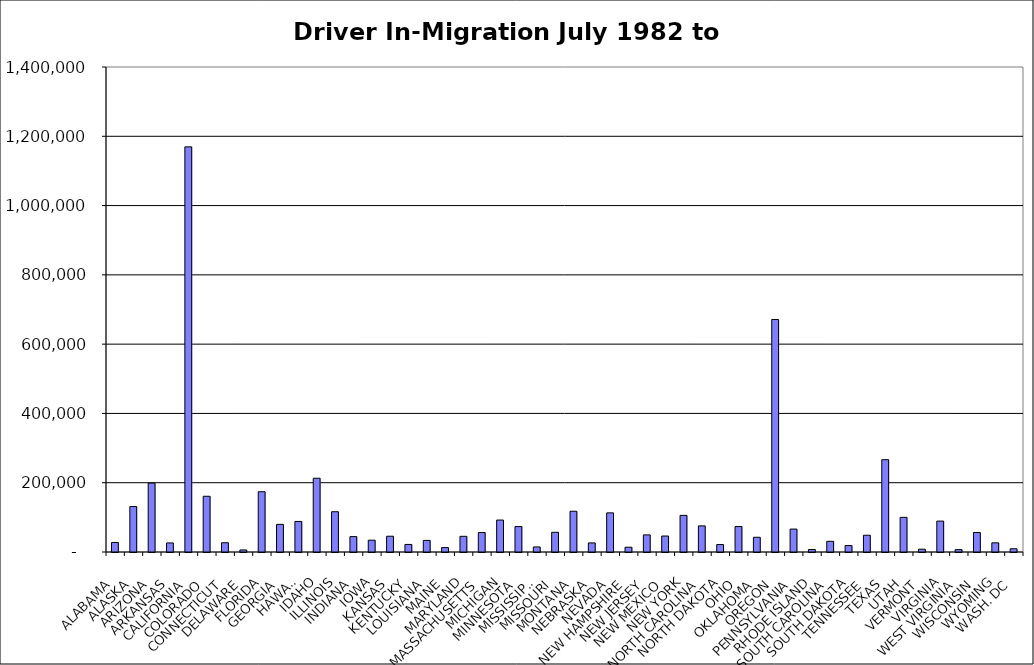
| Category | Series 0 |
|---|---|
| ALABAMA | 27502.5 |
| ALASKA | 131196.5 |
| ARIZONA | 198945 |
| ARKANSAS | 26132.5 |
| CALIFORNIA | 1169442.5 |
| COLORADO | 160876 |
| CONNECTICUT | 26705 |
| DELAWARE | 5878.5 |
| FLORIDA | 173928 |
| GEORGIA | 79786 |
| HAWAII | 88180.5 |
| IDAHO | 212925.5 |
| ILLINOIS | 116263.5 |
| INDIANA | 44389 |
| IOWA | 34079.5 |
| KANSAS | 45545.5 |
| KENTUCKY | 21789 |
| LOUISIANA | 33508.5 |
| MAINE | 12687.5 |
| MARYLAND | 45259 |
| MASSACHUSETTS | 56117 |
| MICHIGAN | 92215 |
| MINNESOTA | 73352.5 |
| MISSISSIPPI | 14606 |
| MISSOURI | 56915 |
| MONTANA | 117646 |
| NEBRASKA | 26163.5 |
| NEVADA | 112949 |
| NEW HAMPSHIRE | 13769.5 |
| NEW JERSEY | 49352 |
| NEW MEXICO | 46130 |
| NEW YORK | 105716 |
| NORTH CAROLINA | 75406.5 |
| NORTH DAKOTA | 21503.5 |
| OHIO | 73469.5 |
| OKLAHOMA | 42497 |
| OREGON | 671156 |
| PENNSYLVANIA | 66199.5 |
| RHODE ISLAND | 7243 |
| SOUTH CAROLINA | 30888.5 |
| SOUTH DAKOTA | 18544.5 |
| TENNESSEE | 48359.5 |
| TEXAS | 266540 |
| UTAH | 100011.5 |
| VERMONT | 8108 |
| VIRGINIA | 89186 |
| WEST VIRGINIA | 6844.5 |
| WISCONSIN | 56260.5 |
| WYOMING | 26456 |
| WASH. DC | 9362 |